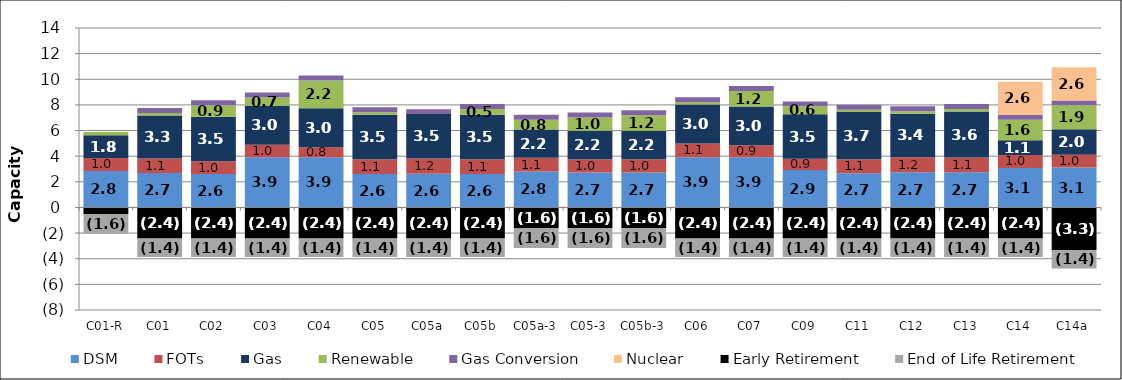
| Category | DSM | FOTs | Gas | Renewable | Gas Conversion | Nuclear | Early Retirement | End of Life Retirement |
|---|---|---|---|---|---|---|---|---|
| C01-R | 2.847 | 1.013 | 1.772 | 0.263 | 0 | 0 | -0.502 | -1.552 |
| C01 | 2.686 | 1.141 | 3.338 | 0.203 | 0.387 | 0 | -2.427 | -1.448 |
| C02 | 2.616 | 0.995 | 3.464 | 0.903 | 0.387 | 0 | -2.427 | -1.448 |
| C03 | 3.914 | 0.977 | 3.041 | 0.655 | 0.387 | 0 | -2.427 | -1.448 |
| C04 | 3.914 | 0.79 | 3.041 | 2.161 | 0.387 | 0 | -2.427 | -1.448 |
| C05 | 2.619 | 1.145 | 3.464 | 0.206 | 0.387 | 0 | -2.427 | -1.448 |
| C05a | 2.627 | 1.192 | 3.464 | 0 | 0.387 | 0 | -2.427 | -1.448 |
| C05b | 2.618 | 1.146 | 3.464 | 0.456 | 0.387 | 0 | -2.427 | -1.448 |
| C05a-3 | 2.81 | 1.059 | 2.217 | 0.764 | 0.387 | 0 | -1.608 | -1.554 |
| C05-3 | 2.735 | 1.026 | 2.217 | 1.039 | 0.387 | 0 | -1.608 | -1.554 |
| C05b-3 | 2.729 | 1.028 | 2.217 | 1.226 | 0.387 | 0 | -1.608 | -1.554 |
| C06 | 3.914 | 1.075 | 3.041 | 0.175 | 0.387 | 0 | -2.427 | -1.448 |
| C07 | 3.914 | 0.93 | 3.041 | 1.197 | 0.387 | 0 | -2.427 | -1.448 |
| C09 | 2.917 | 0.885 | 3.464 | 0.621 | 0.387 | 0 | -2.427 | -1.448 |
| C11 | 2.665 | 1.103 | 3.676 | 0.183 | 0.387 | 0 | -2.427 | -1.448 |
| C12 | 2.749 | 1.174 | 3.386 | 0.198 | 0.387 | 0 | -2.427 | -1.448 |
| C13 | 2.749 | 1.148 | 3.581 | 0.201 | 0.387 | 0 | -2.427 | -1.448 |
| C14 | 3.076 | 1.02 | 1.137 | 1.6 | 0.387 | 2.592 | -2.427 | -1.448 |
| C14a | 3.111 | 1.006 | 1.983 | 1.866 | 0.387 | 2.592 | -3.316 | -1.448 |